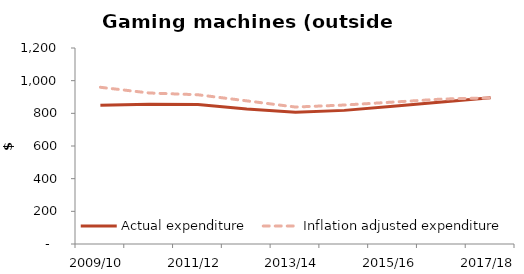
| Category | Actual expenditure | Inflation adjusted expenditure |
|---|---|---|
| 2009/10 | 849.163 | 959.554 |
| 2010/11 | 856.099 | 924.587 |
| 2011/12 | 853.954 | 913.731 |
| 2012/13 | 826.779 | 876.386 |
| 2013/14 | 806.271 | 838.522 |
| 2014/15 | 818.113 | 850.838 |
| 2015/16 | 843.483 | 868.788 |
| 2016/17 | 869.91 | 887.309 |
| 2017/18 | 894.936 | 894.936 |